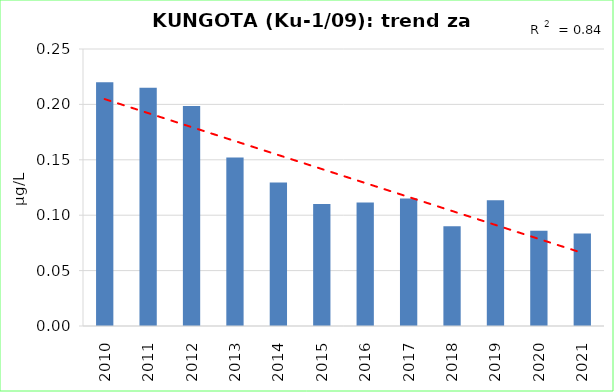
| Category | Vsota |
|---|---|
| 2010 | 0.22 |
| 2011 | 0.215 |
| 2012 | 0.198 |
| 2013 | 0.152 |
| 2014 | 0.13 |
| 2015 | 0.11 |
| 2016 | 0.111 |
| 2017 | 0.115 |
| 2018 | 0.09 |
| 2019 | 0.113 |
| 2020 | 0.086 |
| 2021 | 0.084 |